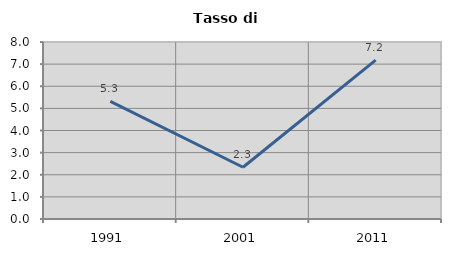
| Category | Tasso di disoccupazione   |
|---|---|
| 1991.0 | 5.318 |
| 2001.0 | 2.339 |
| 2011.0 | 7.18 |